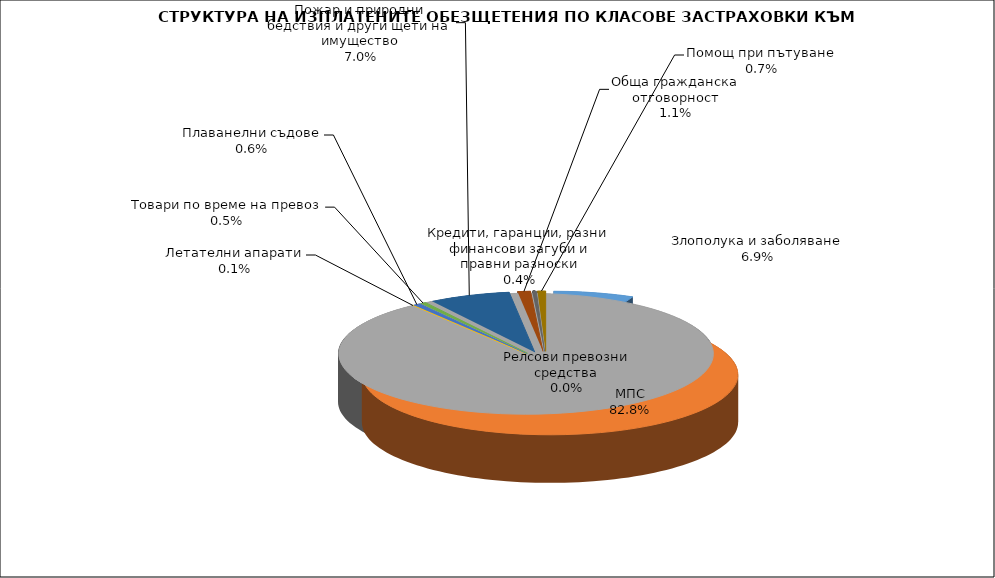
| Category | Злополука и заболяване |
|---|---|
| Злополука и заболяване | 0.069 |
| МПС | 0.828 |
| Релсови превозни средства | 0 |
| Летателни апарати | 0.001 |
| Плаванелни съдове | 0.006 |
| Товари по време на превоз | 0.005 |
| Пожар и природни бедствия и други щети на имущество | 0.07 |
| Обща гражданска отговорност | 0.011 |
| Кредити, гаранции, разни финансови загуби и правни разноски | 0.004 |
| Помощ при пътуване | 0.007 |